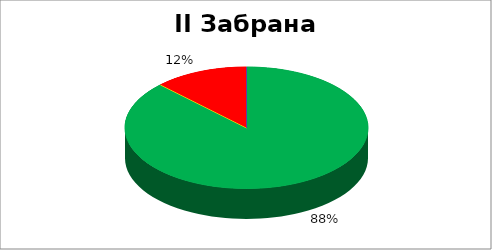
| Category | II Забрана дискриминације |
|---|---|
| 0 | 0.875 |
| 1 | 0 |
| 2 | 0 |
| 3 | 0.125 |
| 4 | 0 |